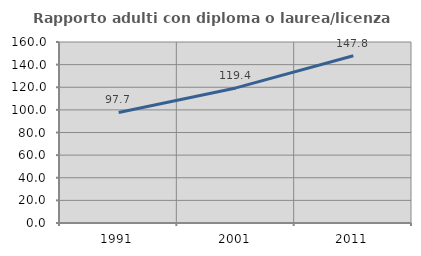
| Category | Rapporto adulti con diploma o laurea/licenza media  |
|---|---|
| 1991.0 | 97.738 |
| 2001.0 | 119.406 |
| 2011.0 | 147.793 |